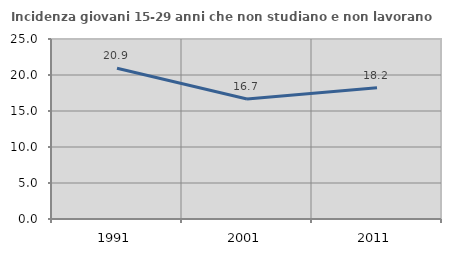
| Category | Incidenza giovani 15-29 anni che non studiano e non lavorano  |
|---|---|
| 1991.0 | 20.948 |
| 2001.0 | 16.66 |
| 2011.0 | 18.219 |